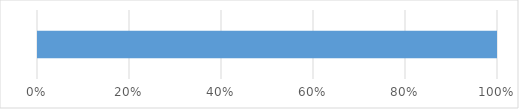
| Category | Series 0 | Series 1 | Series 2 | Series 3 | Series 4 |
|---|---|---|---|---|---|
| 0 | 0 | 0 | 0 | 0 | 14 |